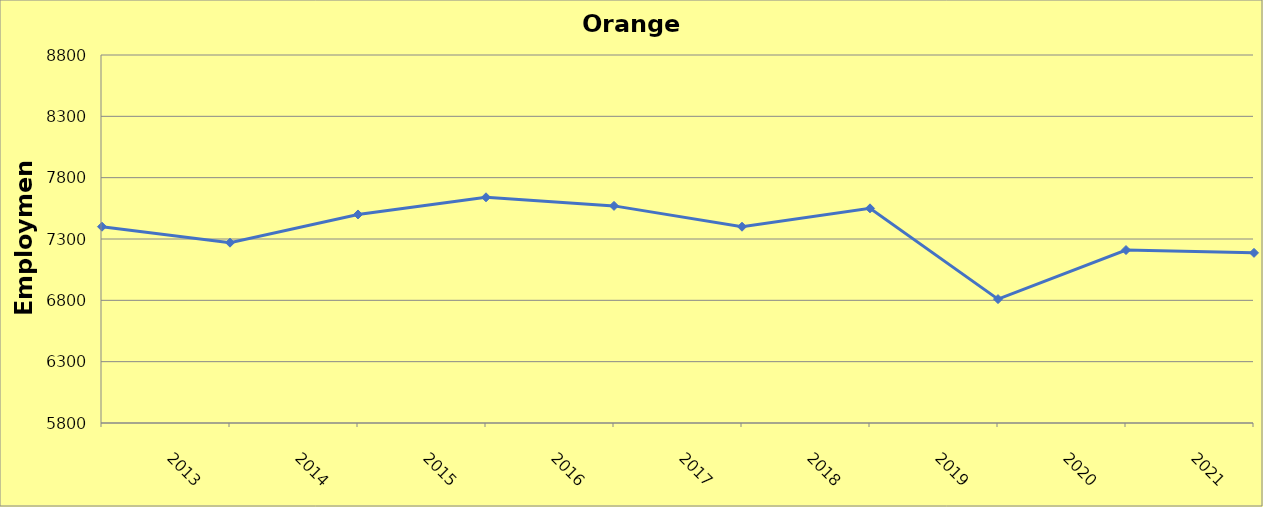
| Category | Orange County |
|---|---|
| 2013.0 | 7400 |
| 2014.0 | 7270 |
| 2015.0 | 7500 |
| 2016.0 | 7640 |
| 2017.0 | 7570 |
| 2018.0 | 7400 |
| 2019.0 | 7550 |
| 2020.0 | 6810 |
| 2021.0 | 7210 |
| 2022.0 | 7187 |